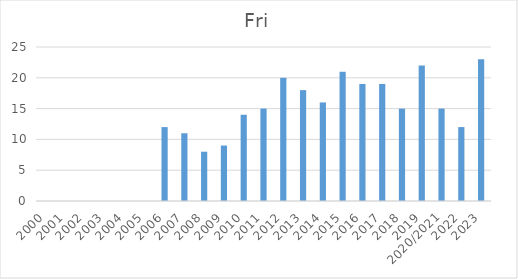
| Category | Fri |
|---|---|
| 2000 | 0 |
| 2001 | 0 |
| 2002 | 0 |
| 2003 | 0 |
| 2004 | 0 |
| 2005 | 0 |
| 2006 | 12 |
| 2007 | 11 |
| 2008 | 8 |
| 2009 | 9 |
| 2010 | 14 |
| 2011 | 15 |
| 2012 | 20 |
| 2013 | 18 |
| 2014 | 16 |
| 2015 | 21 |
| 2016 | 19 |
| 2017 | 19 |
| 2018 | 15 |
| 2019 | 22 |
| 2020/2021 | 15 |
| 2022 | 12 |
| 2023 | 23 |